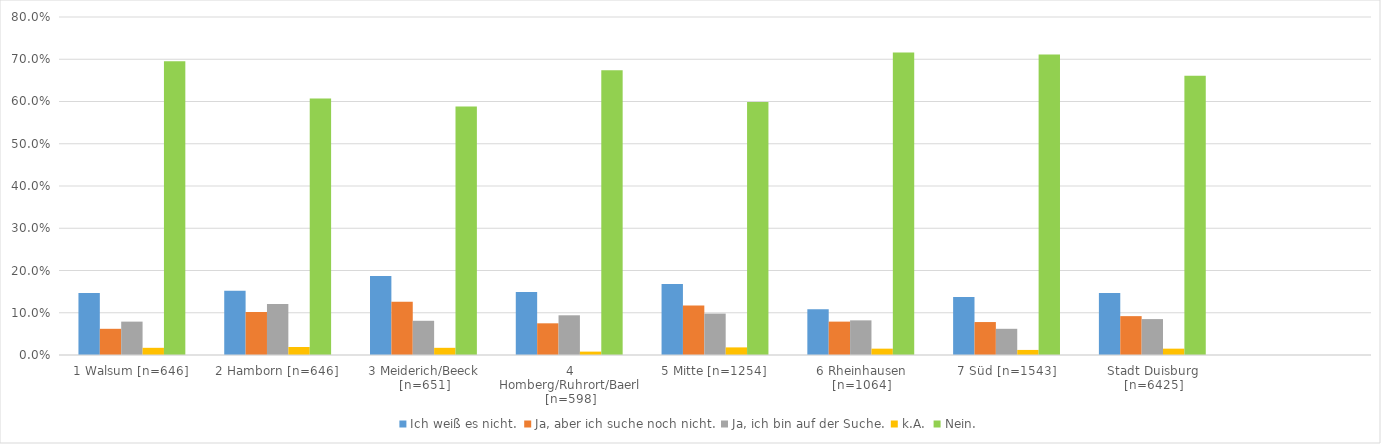
| Category | Ich weiß es nicht. | Ja, aber ich suche noch nicht. | Ja, ich bin auf der Suche. | k.A. | Nein. |
|---|---|---|---|---|---|
| 1 Walsum [n=646] | 0.147 | 0.062 | 0.079 | 0.017 | 0.695 |
| 2 Hamborn [n=646] | 0.152 | 0.102 | 0.121 | 0.019 | 0.607 |
| 3 Meiderich/Beeck [n=651] | 0.187 | 0.126 | 0.081 | 0.017 | 0.588 |
| 4 Homberg/Ruhrort/Baerl [n=598] | 0.149 | 0.075 | 0.094 | 0.008 | 0.674 |
| 5 Mitte [n=1254] | 0.168 | 0.117 | 0.098 | 0.018 | 0.599 |
| 6 Rheinhausen [n=1064] | 0.108 | 0.079 | 0.082 | 0.015 | 0.716 |
| 7 Süd [n=1543] | 0.137 | 0.078 | 0.062 | 0.012 | 0.711 |
| Stadt Duisburg [n=6425] | 0.147 | 0.092 | 0.085 | 0.015 | 0.661 |